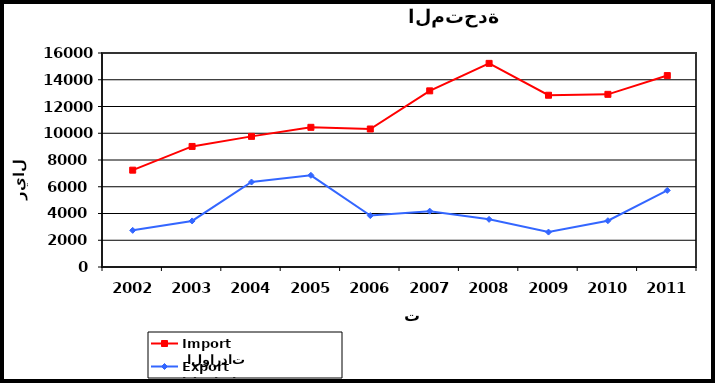
| Category |  الواردات           Import | الصادرات          Export |
|---|---|---|
| 2002.0 | 7240 | 2740 |
| 2003.0 | 9014 | 3443 |
| 2004.0 | 9767 | 6353 |
| 2005.0 | 10443 | 6855 |
| 2006.0 | 10318 | 3843 |
| 2007.0 | 13170 | 4175 |
| 2008.0 | 15225 | 3562 |
| 2009.0 | 12842 | 2612 |
| 2010.0 | 12909 | 3461 |
| 2011.0 | 14313 | 5730 |